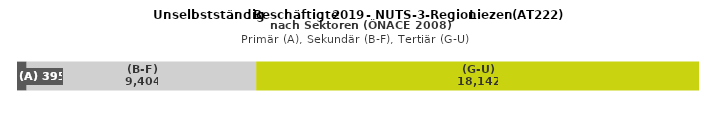
| Category | (A) | (B-F) | (G-U) |
|---|---|---|---|
| 0 | 395 | 9404 | 18142 |